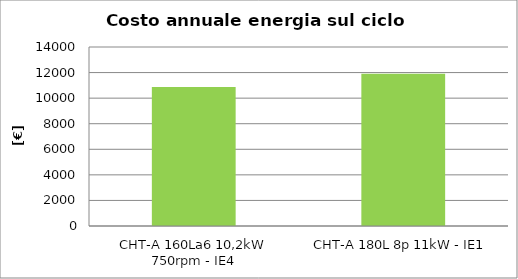
| Category | Series 1 |
|---|---|
| CHT-A 160La6 10,2kW 750rpm - IE4 | 10867.8 |
| CHT-A 180L 8p 11kW - IE1 | 11899.5 |